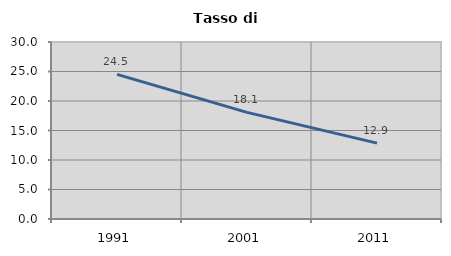
| Category | Tasso di disoccupazione   |
|---|---|
| 1991.0 | 24.517 |
| 2001.0 | 18.074 |
| 2011.0 | 12.855 |